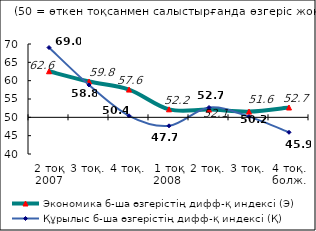
| Category | Экономика б-ша өзгерістің дифф-қ индексі (Э) | Құрылыс б-ша өзгерістің дифф-қ индексі (Қ) |
|---|---|---|
| 2 тоқ 2007 | 62.56 | 69.04 |
| 3 тоқ. | 59.76 | 58.82 |
| 4 тоқ. | 57.57 | 50.42 |
| 1 тоқ 2008  | 52.185 | 47.685 |
| 2 тоқ. | 52.11 | 52.68 |
| 3 тоқ. | 51.56 | 50.205 |
| 4 тоқ. болж. | 52.68 | 45.92 |